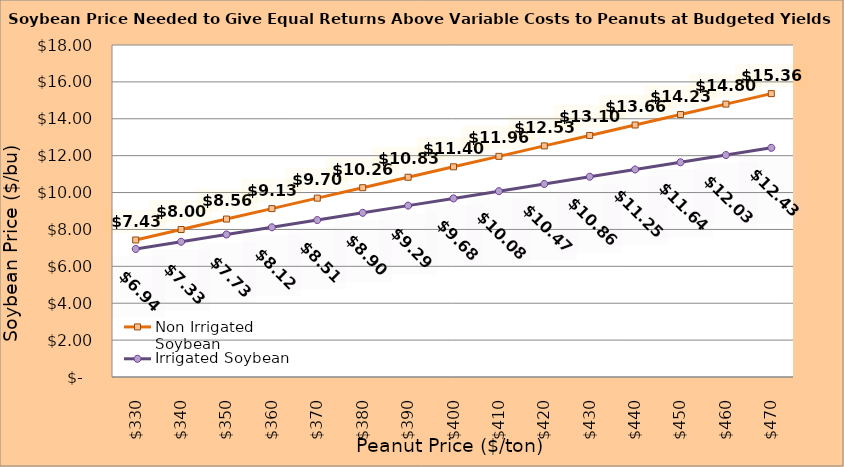
| Category | Non Irrigated Soybean | Irrigated Soybean |
|---|---|---|
| 330.0 | 7.43 | 6.942 |
| 340.0 | 7.996 | 7.333 |
| 350.0 | 8.563 | 7.725 |
| 360.0 | 9.13 | 8.117 |
| 370.0 | 9.696 | 8.508 |
| 380.0 | 10.263 | 8.9 |
| 390.0 | 10.83 | 9.292 |
| 400.0 | 11.396 | 9.683 |
| 410.0 | 11.963 | 10.075 |
| 420.0 | 12.53 | 10.467 |
| 430.0 | 13.096 | 10.858 |
| 440.0 | 13.663 | 11.25 |
| 450.0 | 14.23 | 11.642 |
| 460.0 | 14.796 | 12.033 |
| 470.0 | 15.363 | 12.425 |